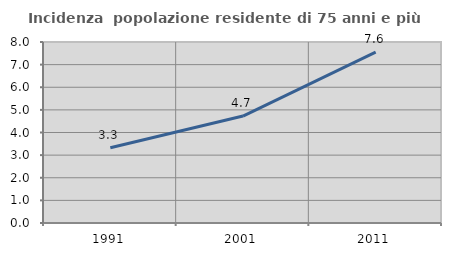
| Category | Incidenza  popolazione residente di 75 anni e più |
|---|---|
| 1991.0 | 3.325 |
| 2001.0 | 4.727 |
| 2011.0 | 7.556 |